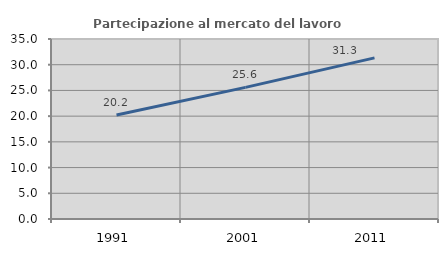
| Category | Partecipazione al mercato del lavoro  femminile |
|---|---|
| 1991.0 | 20.239 |
| 2001.0 | 25.593 |
| 2011.0 | 31.326 |